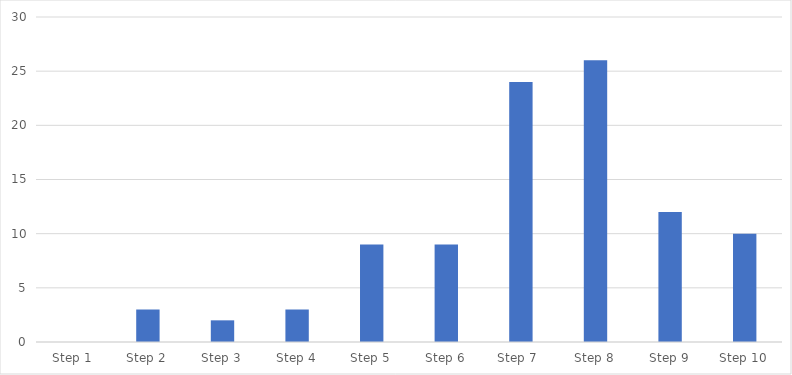
| Category | Number of Responses |
|---|---|
| Step 1 | 0 |
| Step 2 | 3 |
| Step 3 | 2 |
| Step 4 | 3 |
| Step 5 | 9 |
| Step 6 | 9 |
| Step 7  | 24 |
| Step 8 | 26 |
| Step 9 | 12 |
| Step 10 | 10 |